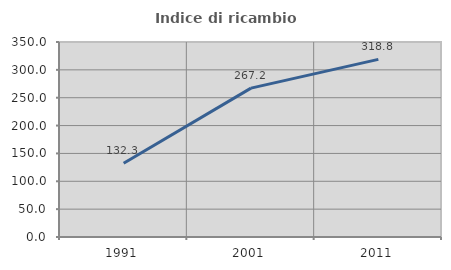
| Category | Indice di ricambio occupazionale  |
|---|---|
| 1991.0 | 132.292 |
| 2001.0 | 267.213 |
| 2011.0 | 318.841 |